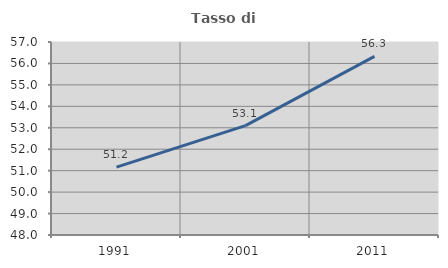
| Category | Tasso di occupazione   |
|---|---|
| 1991.0 | 51.165 |
| 2001.0 | 53.102 |
| 2011.0 | 56.327 |